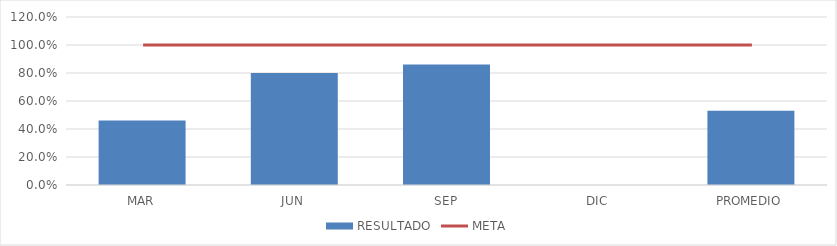
| Category | RESULTADO |
|---|---|
| MAR | 0.46 |
| JUN | 0.8 |
| SEP | 0.86 |
| DIC | 0 |
| PROMEDIO | 0.53 |